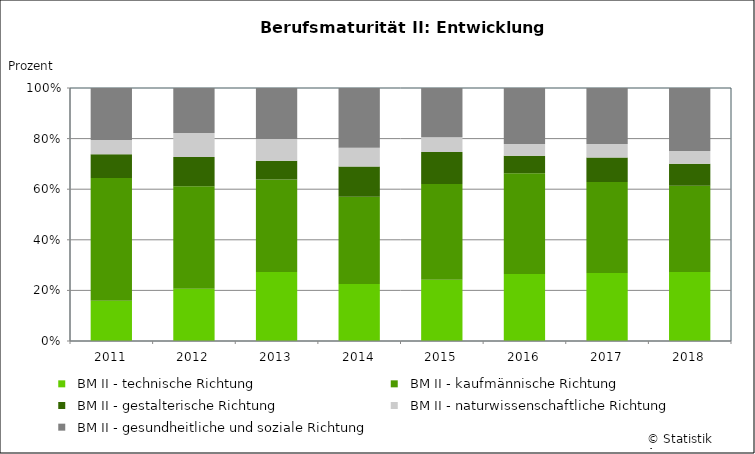
| Category |   BM II - technische Richtung |   BM II - kaufmännische Richtung                |   BM II - gestalterische Richtung               |   BM II - naturwissenschaftliche Richtung      |   BM II - gesundheitliche und soziale Richtung  |
|---|---|---|---|---|---|
| 2011 | 37 | 113 | 22 | 13 | 48 |
| 2012 | 50 | 98 | 28 | 23 | 43 |
| 2013 | 73 | 98 | 20 | 23 | 54 |
| 2014 | 64 | 98 | 34 | 21 | 67 |
| 2015 | 67 | 105 | 35 | 16 | 54 |
| 2016 | 103 | 155 | 27 | 18 | 86 |
| 2017 | 102 | 136 | 37 | 20 | 84 |
| 2018 | 103 | 129 | 33 | 19 | 94 |